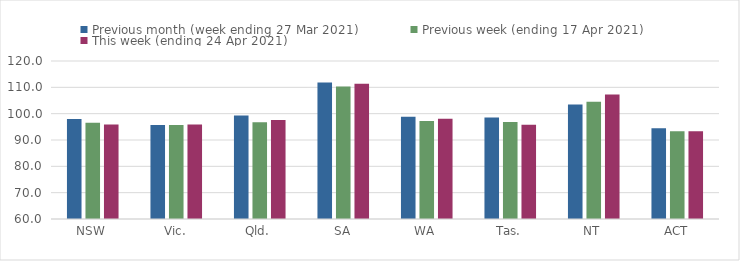
| Category | Previous month (week ending 27 Mar 2021) | Previous week (ending 17 Apr 2021) | This week (ending 24 Apr 2021) |
|---|---|---|---|
| NSW | 97.95 | 96.54 | 95.89 |
| Vic. | 95.65 | 95.69 | 95.91 |
| Qld. | 99.3 | 96.76 | 97.58 |
| SA | 111.87 | 110.28 | 111.32 |
| WA | 98.83 | 97.25 | 98.04 |
| Tas. | 98.53 | 96.88 | 95.8 |
| NT | 103.44 | 104.54 | 107.31 |
| ACT | 94.49 | 93.35 | 93.35 |